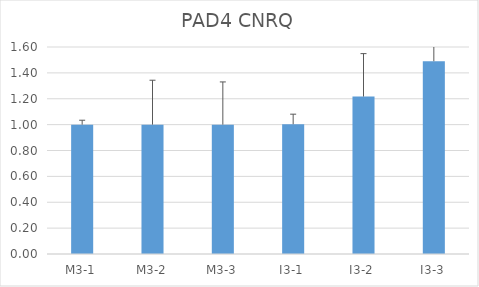
| Category | PAD4 CNRQ |
|---|---|
| M3-1 | 1 |
| M3-2 | 1 |
| M3-3 | 1 |
| I3-1 | 1.003 |
| I3-2 | 1.217 |
| I3-3 | 1.49 |